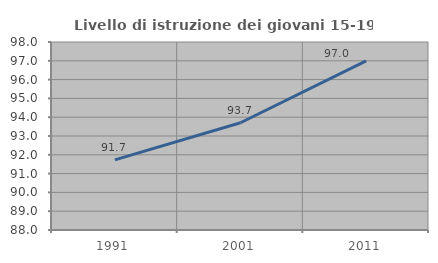
| Category | Livello di istruzione dei giovani 15-19 anni |
|---|---|
| 1991.0 | 91.729 |
| 2001.0 | 93.706 |
| 2011.0 | 97 |